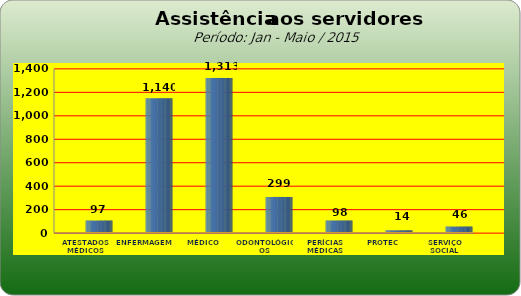
| Category | Series 0 |
|---|---|
| ATESTADOS MÉDICOS | 97 |
| ENFERMAGEM | 1140 |
| MÉDICO | 1313 |
| ODONTOLÓGICOS | 299 |
| PERÍCIAS MÉDICAS | 98 |
| PROTEC | 14 |
| SERVIÇO SOCIAL | 46 |